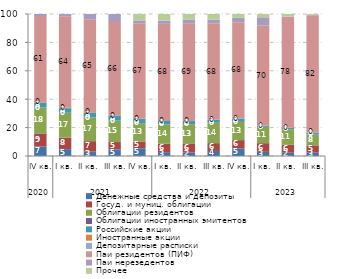
| Category | Денежные средства и депозиты | Госуд. и муниц. облигации | Облигации резидентов | Облигации иностранных эмитентов | Российские акции | Иностранные акции | Депозитарные расписки | Паи резидентов (ПИФ) | Паи нерезедентов | Прочее |
|---|---|---|---|---|---|---|---|---|---|---|
| 0 | 6.696 | 9.217 | 18.188 | 0.058 | 3.426 | 0.355 | 0.086 | 60.518 | 1.45 | 0.007 |
| 1 | 4.843 | 8.058 | 17.483 | 0.088 | 3.2 | 0.31 | 0.032 | 64.384 | 1.592 | 0.009 |
| 2 | 3.061 | 7.393 | 16.591 | 0.094 | 3.461 | 0.336 | 0.031 | 65.074 | 3.949 | 0.01 |
| 3 | 4.539 | 5.279 | 15.019 | 0.082 | 3.412 | 0.02 | 0.003 | 65.964 | 5.666 | 0.016 |
| 4 | 5.422 | 4.797 | 12.887 | 0.073 | 3.061 | 0.016 | 0.003 | 67.214 | 2.025 | 4.502 |
| 5 | 2.72 | 5.911 | 13.531 | 0.069 | 2.428 | 0.039 | 0.025 | 68.365 | 2.267 | 4.647 |
| 6 | 2.43 | 6.45 | 13.483 | 0.072 | 2.165 | 0.025 | 0.017 | 68.767 | 2.433 | 4.157 |
| 7 | 3.542 | 5.518 | 14.273 | 0.074 | 2.011 | 0.027 | 0.023 | 68.046 | 2.521 | 3.966 |
| 8 | 5.31 | 5.868 | 12.785 | 0.065 | 2.316 | 0.029 | 0.022 | 67.817 | 3.174 | 2.615 |
| 9 | 2.919 | 6.127 | 11.412 | 0.056 | 0.907 | 0.023 | 0.008 | 70.316 | 5.912 | 2.321 |
| 10 | 2.301 | 5.614 | 10.885 | 0.089 | 1.025 | 0.168 | 0.043 | 77.754 | 0.235 | 1.885 |
| 11 | 2.638 | 4.861 | 7.646 | 0.203 | 1.128 | 0.206 | 0.041 | 82.461 | 0.279 | 0.536 |